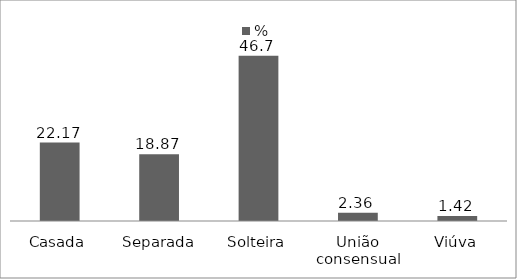
| Category | % |
|---|---|
| Casada | 22.17 |
| Separada | 18.87 |
| Solteira | 46.7 |
| União consensual | 2.36 |
| Viúva | 1.42 |